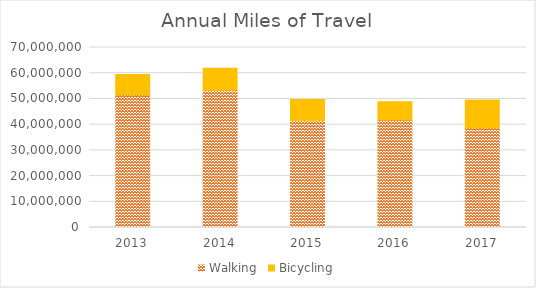
| Category | Walking | Bicycling |
|---|---|---|
| 2013 | 51573587.794 | 7967031.801 |
| 2014 | 53402793.376 | 8561805.299 |
| 2015 | 41516422.727 | 8218908.94 |
| 2016 | 41851467.842 | 7071799.295 |
| 2017 | 38669444.079 | 10918619.479 |